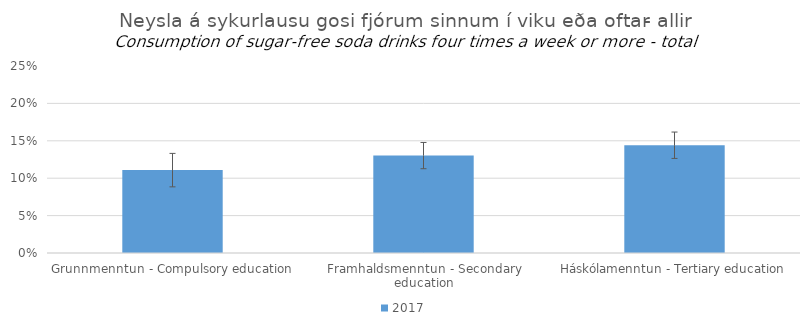
| Category | 2017 |
|---|---|
| Grunnmenntun - Compulsory education | 0.111 |
| Framhaldsmenntun - Secondary education | 0.13 |
| Háskólamenntun - Tertiary education | 0.144 |